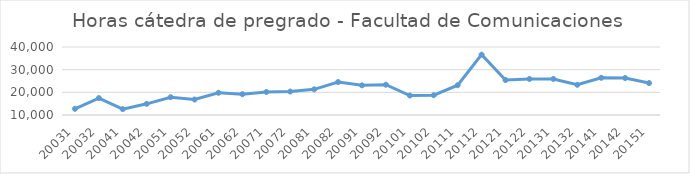
| Category | Total horas |
|---|---|
| 20031 | 12730 |
| 20032 | 17462 |
| 20041 | 12590 |
| 20042 | 14926 |
| 20051 | 17842 |
| 20052 | 16830 |
| 20061 | 19818 |
| 20062 | 19196 |
| 20071 | 20159 |
| 20072 | 20345 |
| 20081 | 21328 |
| 20082 | 24536 |
| 20091 | 23085 |
| 20092 | 23352 |
| 20101 | 18586 |
| 20102 | 18727 |
| 20111 | 23138 |
| 20112 | 36620 |
| 20121 | 25437 |
| 20122 | 25893 |
| 20131 | 25908 |
| 20132 | 23323 |
| 20141 | 26411 |
| 20142 | 26313 |
| 20151 | 24086 |